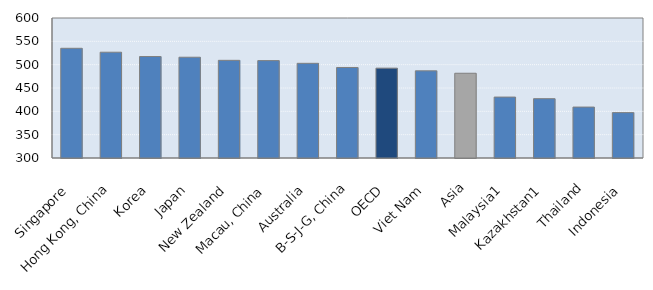
| Category | 2015 |
|---|---|
| Singapore | 535.1 |
| Hong Kong, China | 526.675 |
| Korea | 517.437 |
| Japan | 515.958 |
| New Zealand | 509.271 |
| Macau, China | 508.691 |
| Australia | 502.901 |
| B-S-J-G, China | 493.941 |
| OECD | 492.549 |
| Viet Nam | 486.774 |
| Asia | 481.604 |
| Malaysia1 | 430.578 |
| Kazakhstan1 | 427.141 |
| Thailand | 409.13 |
| Indonesia | 397.259 |